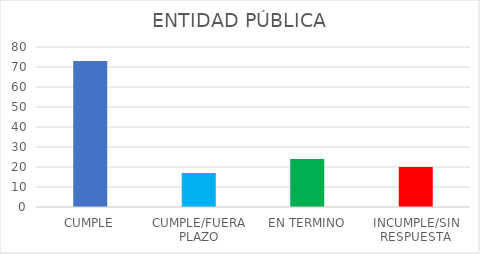
| Category | Series 0 |
|---|---|
| CUMPLE | 73 |
| CUMPLE/FUERA PLAZO | 17 |
| EN TERMINO | 24 |
| INCUMPLE/SIN RESPUESTA | 20 |